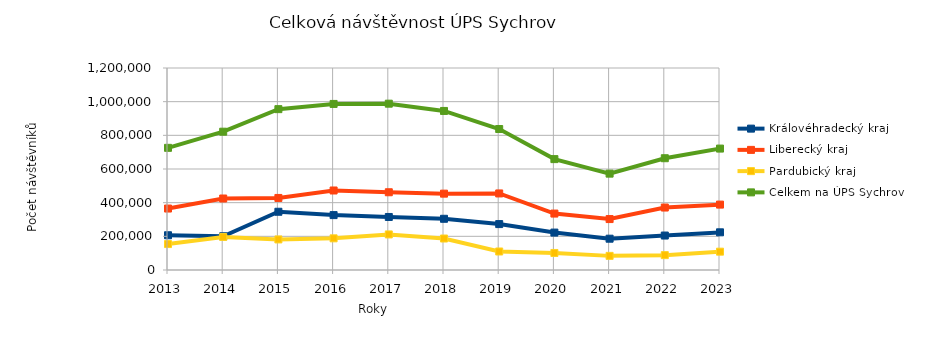
| Category | Královéhradecký kraj | Liberecký kraj | Pardubický kraj | Celkem na ÚPS Sychrov |
|---|---|---|---|---|
| 2013.0 | 206419 | 365108 | 154165 | 725692 |
| 2014.0 | 200438 | 424718 | 196473 | 821629 |
| 2015.0 | 345970 | 428023 | 181567 | 955560 |
| 2016.0 | 326137 | 472318 | 188108 | 986563 |
| 2017.0 | 314983 | 461803 | 211268 | 988054 |
| 2018.0 | 304267 | 453568 | 187017 | 944852 |
| 2019.0 | 272720 | 454785 | 109949 | 837454 |
| 2020.0 | 222238 | 335261 | 101211 | 658710 |
| 2021.0 | 185934 | 302574 | 83925 | 572433 |
| 2022.0 | 204678 | 371041 | 88282 | 664001 |
| 2023.0 | 223799 | 388530 | 108959 | 721288 |